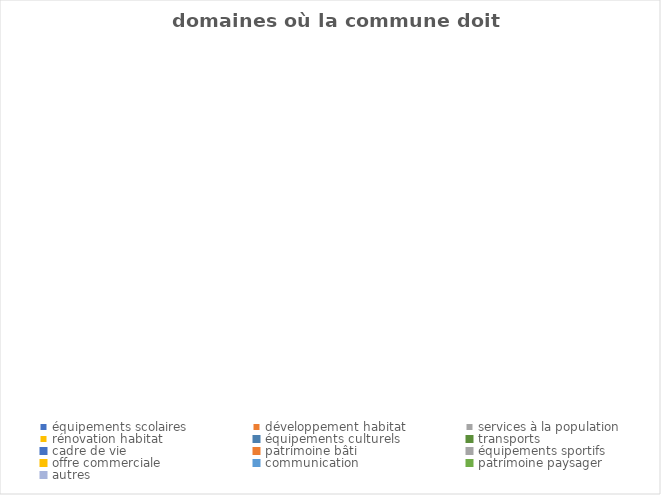
| Category | Series 0 |
|---|---|
| équipements scolaires  | 0 |
| développement habitat  | 0 |
| services à la population  | 0 |
| rénovation habitat  | 0 |
| équipements culturels | 0 |
| transports | 0 |
| cadre de vie | 0 |
| patrimoine bâti  | 0 |
| équipements sportifs | 0 |
| offre commerciale | 0 |
| communication  | 0 |
| patrimoine paysager  | 0 |
| autres  | 0 |